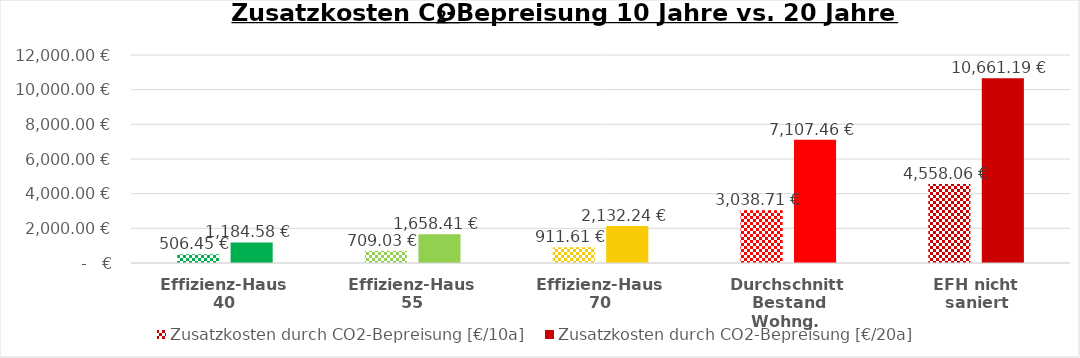
| Category | Zusatzkosten durch CO2-Bepreisung [€/10a]  | Zusatzkosten durch CO2-Bepreisung [€/20a] |
|---|---|---|
| Effizienz-Haus 40 | 506.451 | 1184.577 |
| Effizienz-Haus 55 | 709.032 | 1658.408 |
| Effizienz-Haus 70 | 911.612 | 2132.239 |
| Durchschnitt
Bestand Wohng.  | 3038.707 | 7107.463 |
| EFH nicht saniert | 4558.061 | 10661.194 |